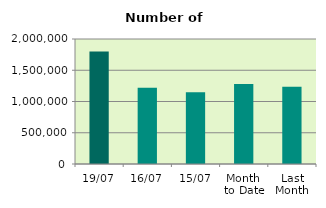
| Category | Series 0 |
|---|---|
| 19/07 | 1800774 |
| 16/07 | 1219804 |
| 15/07 | 1148070 |
| Month 
to Date | 1280784.615 |
| Last
Month | 1237407.909 |